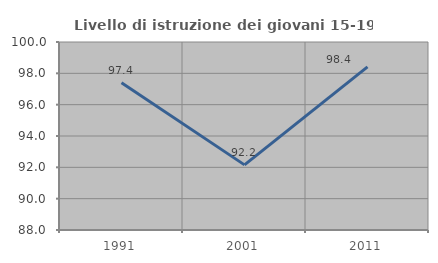
| Category | Livello di istruzione dei giovani 15-19 anni |
|---|---|
| 1991.0 | 97.403 |
| 2001.0 | 92.157 |
| 2011.0 | 98.413 |